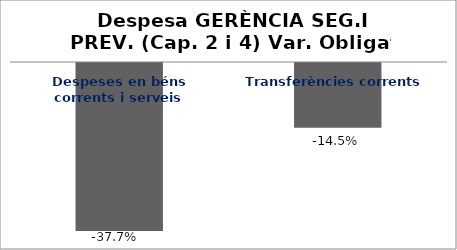
| Category | Series 0 |
|---|---|
| Despeses en béns corrents i serveis | -0.377 |
| Transferències corrents | -0.145 |